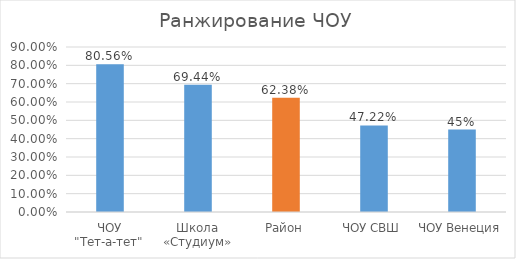
| Category | Series 0 |
|---|---|
| ЧОУ "Тет-а-тет" | 0.806 |
| Школа «Студиум» | 0.694 |
| Район | 0.624 |
| ЧОУ СВШ | 0.472 |
| ЧОУ Венеция | 0.45 |